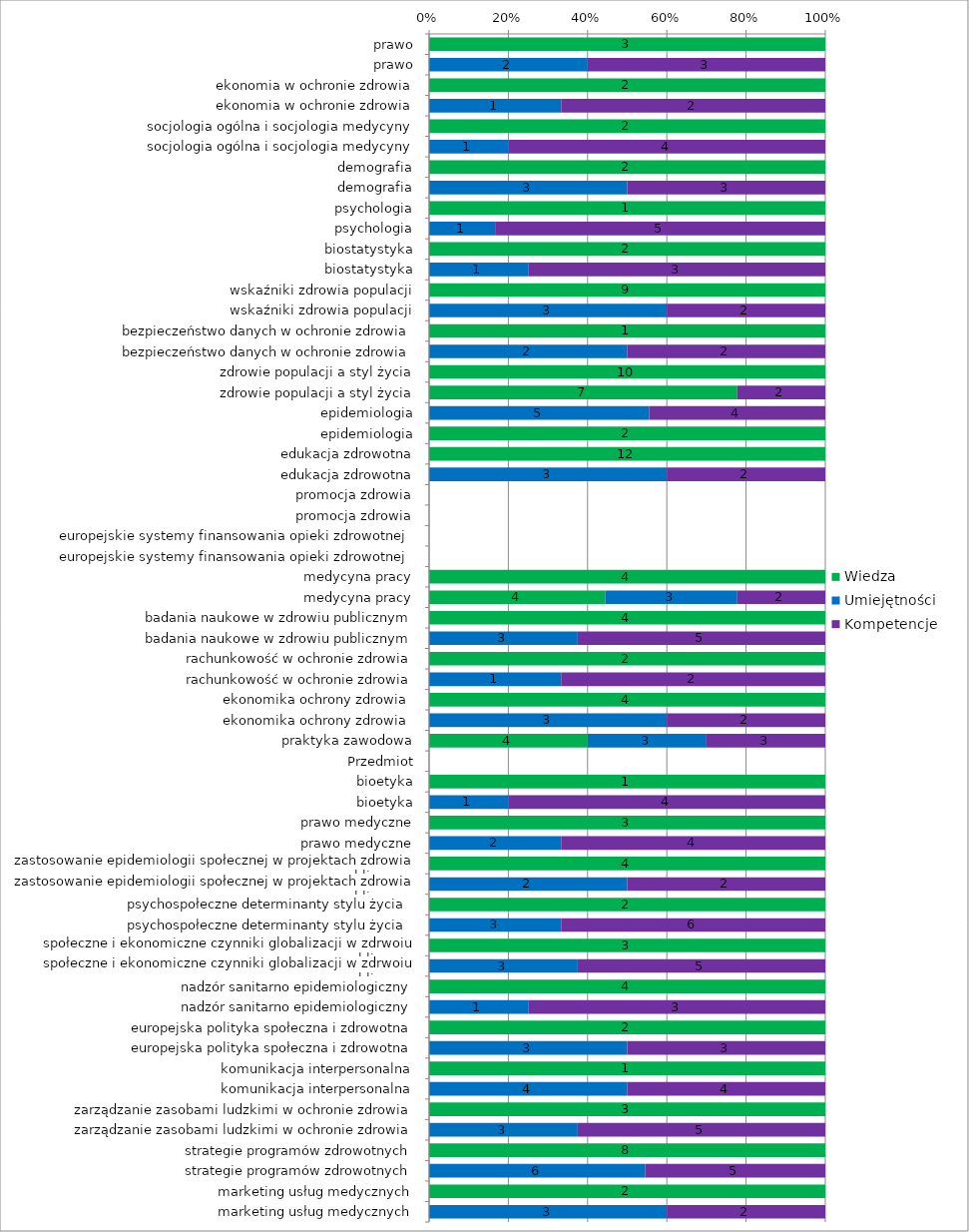
| Category | Wiedza | Umiejętności | Kompetencje |
|---|---|---|---|
|  prawo | 3 | 0 | 0 |
|  prawo | 0 | 2 | 3 |
|  ekonomia w ochronie zdrowia | 2 | 0 | 0 |
|  ekonomia w ochronie zdrowia | 0 | 1 | 2 |
|  socjologia ogólna i socjologia medycyny | 2 | 0 | 0 |
|  socjologia ogólna i socjologia medycyny | 0 | 1 | 4 |
|  demografia | 2 | 0 | 0 |
|  demografia | 0 | 3 | 3 |
|  psychologia | 1 | 0 | 0 |
|  psychologia | 0 | 1 | 5 |
|  biostatystyka | 2 | 0 | 0 |
|  biostatystyka | 0 | 1 | 3 |
| wskaźniki zdrowia populacji | 9 | 0 | 0 |
| wskaźniki zdrowia populacji | 0 | 3 | 2 |
| bezpieczeństwo danych w ochronie zdrowia | 1 | 0 | 0 |
| bezpieczeństwo danych w ochronie zdrowia | 0 | 2 | 2 |
| zdrowie populacji a styl życia | 10 | 0 | 0 |
| zdrowie populacji a styl życia | 7 | 0 | 2 |
| epidemiologia | 0 | 5 | 4 |
| epidemiologia | 2 | 0 | 0 |
| edukacja zdrowotna | 12 | 0 | 0 |
| edukacja zdrowotna | 0 | 3 | 2 |
| promocja zdrowia | 0 | 0 | 0 |
| promocja zdrowia | 0 | 0 | 0 |
| europejskie systemy finansowania opieki zdrowotnej  | 0 | 0 | 0 |
| europejskie systemy finansowania opieki zdrowotnej  | 0 | 0 | 0 |
| medycyna pracy | 4 | 0 | 0 |
| medycyna pracy | 4 | 3 | 2 |
| badania naukowe w zdrowiu publicznym | 4 | 0 | 0 |
| badania naukowe w zdrowiu publicznym | 0 | 3 | 5 |
| rachunkowość w ochronie zdrowia | 2 | 0 | 0 |
| rachunkowość w ochronie zdrowia | 0 | 1 | 2 |
| ekonomika ochrony zdrowia  | 4 | 0 | 0 |
| ekonomika ochrony zdrowia  | 0 | 3 | 2 |
| praktyka zawodowa | 4 | 3 | 3 |
| Przedmiot | 0 | 0 | 0 |
| bioetyka | 1 | 0 | 0 |
| bioetyka | 0 | 1 | 4 |
| prawo medyczne | 3 | 0 | 0 |
| prawo medyczne | 0 | 2 | 4 |
| zastosowanie epidemiologii społecznej w projektach zdrowia publicznego | 4 | 0 | 0 |
| zastosowanie epidemiologii społecznej w projektach zdrowia publicznego | 0 | 2 | 2 |
| psychospołeczne determinanty stylu życia  | 2 | 0 | 0 |
| psychospołeczne determinanty stylu życia  | 0 | 3 | 6 |
| społeczne i ekonomiczne czynniki globalizacji w zdrwoiu publicznym | 3 | 0 | 0 |
| społeczne i ekonomiczne czynniki globalizacji w zdrwoiu publicznym | 0 | 3 | 5 |
| nadzór sanitarno epidemiologiczny | 4 | 0 | 0 |
| nadzór sanitarno epidemiologiczny | 0 | 1 | 3 |
| europejska polityka społeczna i zdrowotna | 2 | 0 | 0 |
| europejska polityka społeczna i zdrowotna | 0 | 3 | 3 |
| komunikacja interpersonalna | 1 | 0 | 0 |
| komunikacja interpersonalna | 0 | 4 | 4 |
| zarządzanie zasobami ludzkimi w ochronie zdrowia | 3 | 0 | 0 |
| zarządzanie zasobami ludzkimi w ochronie zdrowia | 0 | 3 | 5 |
| strategie programów zdrowotnych | 8 | 0 | 0 |
| strategie programów zdrowotnych | 0 | 6 | 5 |
| marketing usług medycznych | 2 | 0 | 0 |
| marketing usług medycznych | 0 | 3 | 2 |